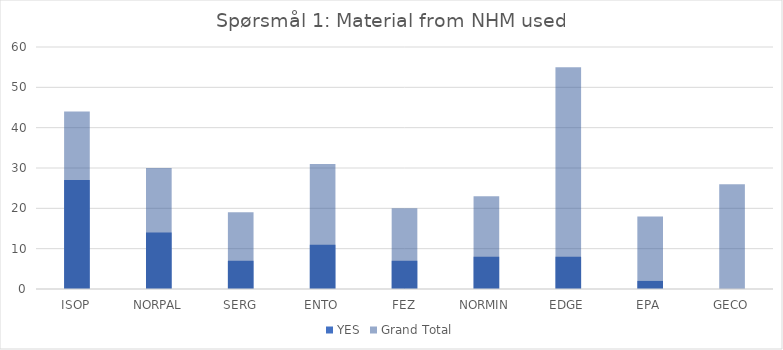
| Category | YES | Grand Total |
|---|---|---|
| ISOP | 27 | 44 |
| NORPAL | 14 | 30 |
| SERG | 7 | 19 |
| ENTO | 11 | 31 |
| FEZ | 7 | 20 |
| NORMIN | 8 | 23 |
| EDGE | 8 | 55 |
| EPA | 2 | 18 |
| GECO | 0 | 26 |